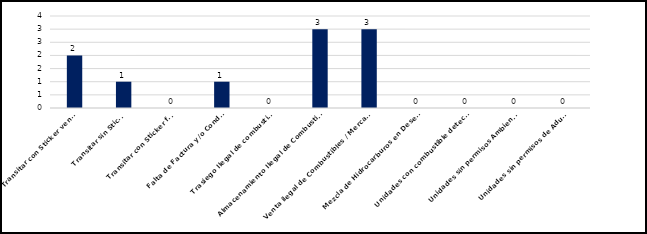
| Category | Series 0 |
|---|---|
| Transitar con Sticker vencido | 2 |
| Transitar sin Sticker | 1 |
| Transitar con Sticker falso | 0 |
| Falta de Factura y/o Conduce | 1 |
| Trasiego Ilegal de combustibles  | 0 |
| Almacenamiento Ilegal de Combustibles  | 3 |
| Venta ilegal de Combustibles / Mercancías | 3 |
| Mezcla de Hidrocarburos en Desechos | 0 |
| Unidades con combustible detectado  | 0 |
| Unidades sin permisos Ambientales | 0 |
| Unidades sin permisos de Aduanas  | 0 |